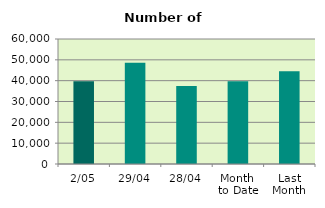
| Category | Series 0 |
|---|---|
| 2/05 | 39704 |
| 29/04 | 48588 |
| 28/04 | 37466 |
| Month 
to Date | 39704 |
| Last
Month | 44538 |